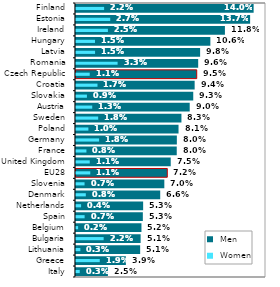
| Category |  Men |
|---|---|
| Italy | 0.025 |
| Greece | 0.039 |
| Lithuania | 0.051 |
| Bulgaria | 0.051 |
| Belgium | 0.052 |
| Spain | 0.053 |
| Netherlands | 0.053 |
| Denmark | 0.066 |
| Slovenia | 0.07 |
| EU28 | 0.072 |
| United Kingdom | 0.075 |
| France | 0.08 |
| Germany | 0.08 |
| Poland | 0.081 |
| Sweden | 0.083 |
| Austria | 0.09 |
| Slovakia | 0.093 |
| Croatia | 0.094 |
| Czech Republic | 0.095 |
| Romania | 0.096 |
| Latvia | 0.098 |
| Hungary | 0.106 |
| Ireland | 0.118 |
| Estonia | 0.137 |
| Finland | 0.14 |